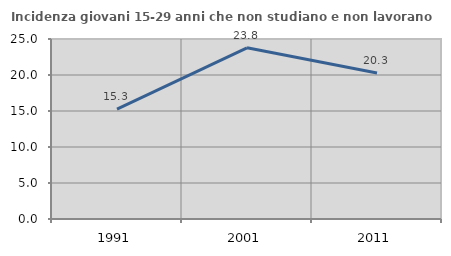
| Category | Incidenza giovani 15-29 anni che non studiano e non lavorano  |
|---|---|
| 1991.0 | 15.258 |
| 2001.0 | 23.779 |
| 2011.0 | 20.285 |